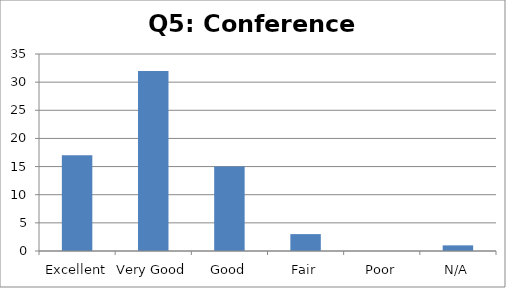
| Category | Response count |
|---|---|
| Excellent | 17 |
| Very Good | 32 |
| Good | 15 |
| Fair | 3 |
| Poor | 0 |
| N/A | 1 |